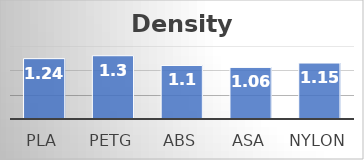
| Category | Density kg/L |
|---|---|
| PLA | 1.24 |
| PETG | 1.3 |
| ABS | 1.1 |
| ASA | 1.06 |
| Nylon | 1.15 |